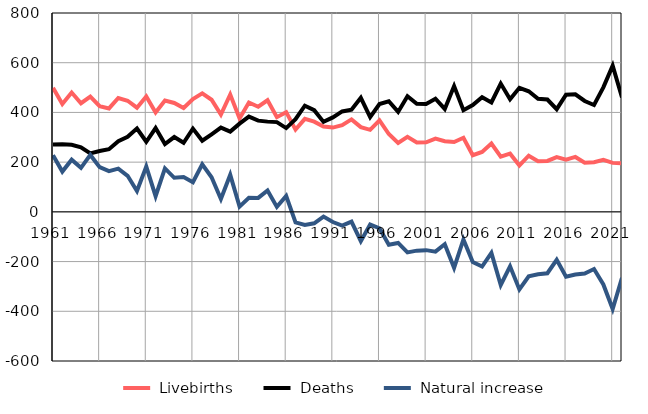
| Category |  Livebirths |  Deaths |  Natural increase |
|---|---|---|---|
| 1961.0 | 499 | 271 | 228 |
| 1962.0 | 434 | 272 | 162 |
| 1963.0 | 480 | 270 | 210 |
| 1964.0 | 437 | 260 | 177 |
| 1965.0 | 464 | 235 | 229 |
| 1966.0 | 425 | 245 | 180 |
| 1967.0 | 416 | 252 | 164 |
| 1968.0 | 458 | 284 | 174 |
| 1969.0 | 447 | 302 | 145 |
| 1970.0 | 419 | 335 | 84 |
| 1971.0 | 464 | 282 | 182 |
| 1972.0 | 400 | 337 | 63 |
| 1973.0 | 448 | 273 | 175 |
| 1974.0 | 438 | 301 | 137 |
| 1975.0 | 418 | 278 | 140 |
| 1976.0 | 454 | 335 | 119 |
| 1977.0 | 477 | 286 | 191 |
| 1978.0 | 451 | 312 | 139 |
| 1979.0 | 391 | 339 | 52 |
| 1980.0 | 472 | 323 | 149 |
| 1981.0 | 376 | 355 | 21 |
| 1982.0 | 440 | 383 | 57 |
| 1983.0 | 423 | 367 | 56 |
| 1984.0 | 449 | 363 | 86 |
| 1985.0 | 381 | 361 | 20 |
| 1986.0 | 401 | 337 | 64 |
| 1987.0 | 331 | 373 | -42 |
| 1988.0 | 374 | 427 | -53 |
| 1989.0 | 363 | 409 | -46 |
| 1990.0 | 343 | 362 | -19 |
| 1991.0 | 339 | 380 | -41 |
| 1992.0 | 349 | 404 | -55 |
| 1993.0 | 372 | 411 | -39 |
| 1994.0 | 341 | 459 | -118 |
| 1995.0 | 330 | 381 | -51 |
| 1996.0 | 368 | 434 | -66 |
| 1997.0 | 313 | 445 | -132 |
| 1998.0 | 277 | 402 | -125 |
| 1999.0 | 302 | 465 | -163 |
| 2000.0 | 279 | 435 | -156 |
| 2001.0 | 280 | 434 | -154 |
| 2002.0 | 295 | 455 | -160 |
| 2003.0 | 284 | 414 | -130 |
| 2004.0 | 281 | 506 | -225 |
| 2005.0 | 298 | 409 | -111 |
| 2006.0 | 228 | 430 | -202 |
| 2007.0 | 241 | 461 | -220 |
| 2008.0 | 275 | 440 | -165 |
| 2009.0 | 222 | 516 | -294 |
| 2010.0 | 234 | 453 | -219 |
| 2011.0 | 187 | 499 | -312 |
| 2012.0 | 226 | 485 | -259 |
| 2013.0 | 204 | 455 | -251 |
| 2014.0 | 205 | 452 | -247 |
| 2015.0 | 220 | 413 | -193 |
| 2016.0 | 210 | 471 | -261 |
| 2017.0 | 221 | 473 | -252 |
| 2018.0 | 198 | 446 | -248 |
| 2019.0 | 200 | 430 | -230 |
| 2020.0 | 209 | 501 | -292 |
| 2021.0 | 197 | 588 | -391 |
| 2022.0 | 195 | 460 | -265 |